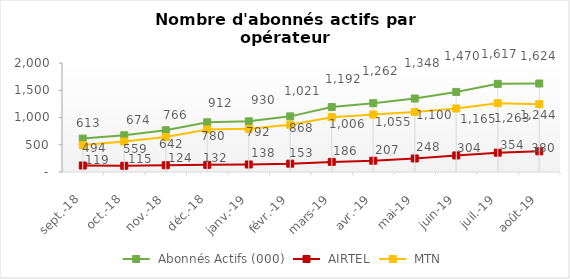
| Category | Series 5 | Series 6 | Series 7 |
|---|---|---|---|
| sept.-18 | 612.774 | 119.016 | 493.758 |
| oct.-18 | 674.073 | 114.58 | 559.493 |
| nov.-18 | 766.339 | 123.914 | 642.425 |
| déc.-18 | 911.789 | 131.647 | 780.142 |
| janv.-19 | 930.174 | 138.437 | 791.737 |
| févr.-19 | 1020.836 | 152.964 | 867.872 |
| mars-19 | 1191.865 | 185.632 | 1006.233 |
| avr.-19 | 1262.375 | 207.48 | 1054.895 |
| mai-19 | 1348.464 | 248.399 | 1100.065 |
| juin-19 | 1469.506 | 304.086 | 1165.42 |
| juil.-19 | 1617.302 | 354.468 | 1262.834 |
| août-19 | 1623.629 | 379.5 | 1244.129 |